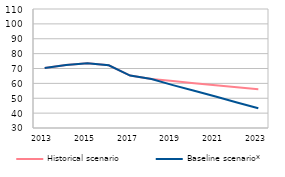
| Category | Historical scenario | Baseline scenario* |
|---|---|---|
| 2013.0 | 70.405 | 70.405 |
| 2014.0 | 72.402 | 72.402 |
| 2015.0 | 73.452 | 73.452 |
| 2016.0 | 72.149 | 72.149 |
| 2017.0 | 65.225 | 65.225 |
| 2018.0 | 62.88 | 62.88 |
| 2019.0 | 61.518 | 58.83 |
| 2020.0 | 60.154 | 55.062 |
| 2021.0 | 58.789 | 51.118 |
| 2022.0 | 57.423 | 47.147 |
| 2023.0 | 56.056 | 43.261 |